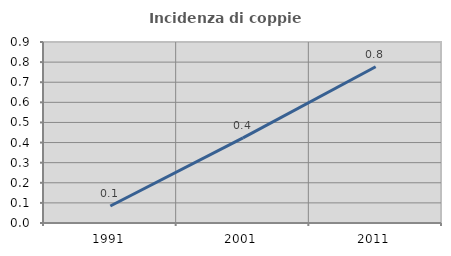
| Category | Incidenza di coppie miste |
|---|---|
| 1991.0 | 0.084 |
| 2001.0 | 0.424 |
| 2011.0 | 0.777 |